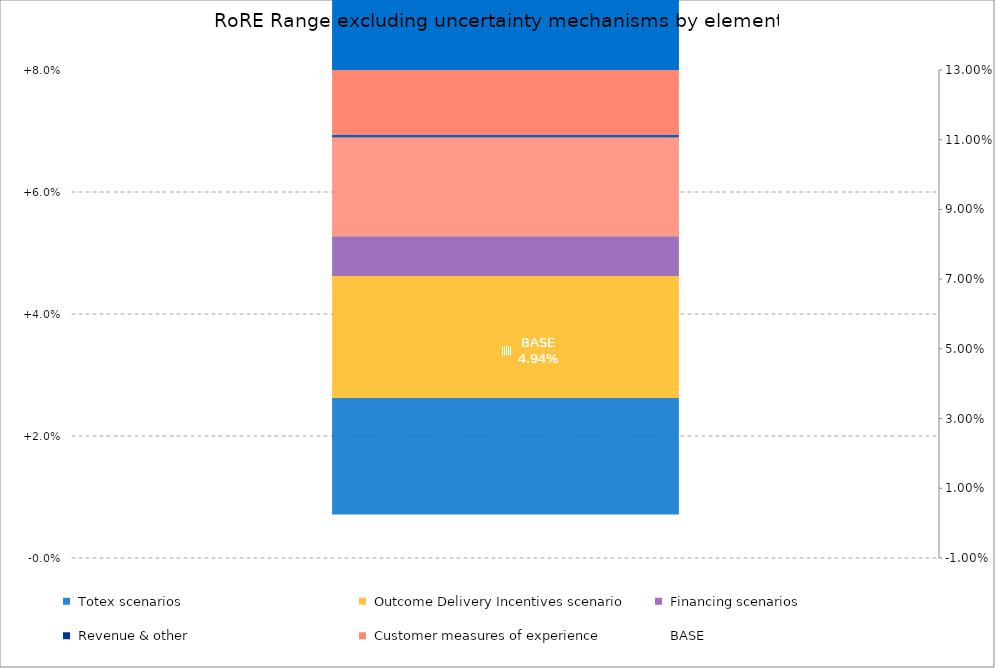
| Category |  Minimum  |  Totex scenarios  |  Outcome Delivery Incentives scenario  |  Financing scenarios  |  Customer measures of experience  |  Revenue & other  | Series 21 | Series 22 | Series 23 | Series 24 | Series 25 | Series 26 | Series 27 | Series 28 |
|---|---|---|---|---|---|---|---|---|---|---|---|---|---|---|
| RoRE Base case | 0.007 | 0.019 | 0.02 | 0.007 | 0.013 | 0 |  |  |  |  |  |  |  |  |